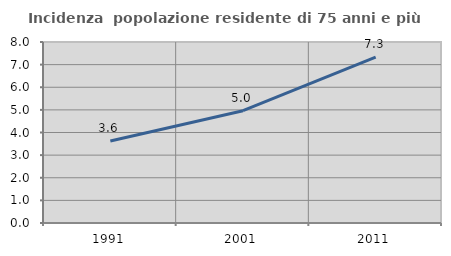
| Category | Incidenza  popolazione residente di 75 anni e più |
|---|---|
| 1991.0 | 3.622 |
| 2001.0 | 4.965 |
| 2011.0 | 7.335 |